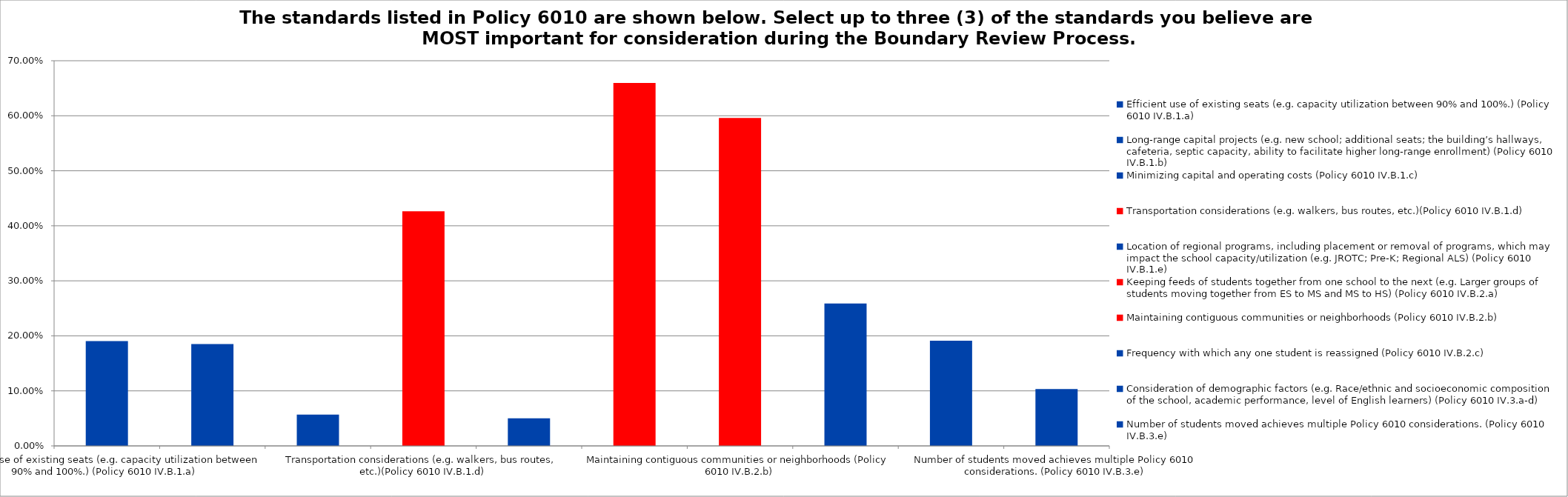
| Category | Responses |
|---|---|
| Efficient use of existing seats (e.g. capacity utilization between 90% and 100%.) (Policy 6010 IV.B.1.a) | 0.19 |
| Long-range capital projects (e.g. new school; additional seats; the building’s hallways, cafeteria, septic capacity, ability to facilitate higher long-range enrollment) (Policy 6010 IV.B.1.b) | 0.185 |
| Minimizing capital and operating costs (Policy 6010 IV.B.1.c) | 0.057 |
| Transportation considerations (e.g. walkers, bus routes, etc.)(Policy 6010 IV.B.1.d) | 0.426 |
| Location of regional programs, including placement or removal of programs, which may impact the school capacity/utilization (e.g. JROTC; Pre-K; Regional ALS) (Policy 6010 IV.B.1.e) | 0.05 |
| Keeping feeds of students together from one school to the next (e.g. Larger groups of students moving together from ES to MS and MS to HS) (Policy 6010 IV.B.2.a) | 0.66 |
| Maintaining contiguous communities or neighborhoods (Policy 6010 IV.B.2.b) | 0.596 |
| Frequency with which any one student is reassigned (Policy 6010 IV.B.2.c) | 0.259 |
| Consideration of demographic factors (e.g. Race/ethnic and socioeconomic composition of the school, academic performance, level of English learners) (Policy 6010 IV.3.a-d) | 0.191 |
| Number of students moved achieves multiple Policy 6010 considerations. (Policy 6010 IV.B.3.e) | 0.103 |